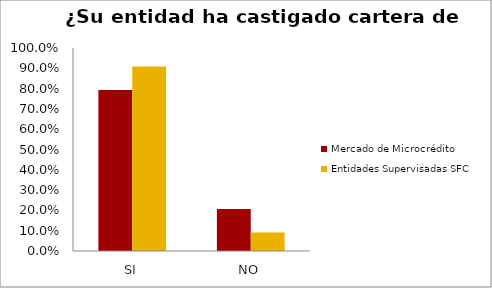
| Category | Mercado de Microcrédito | Entidades Supervisadas SFC |
|---|---|---|
| SI | 0.793 | 0.909 |
| NO | 0.207 | 0.091 |